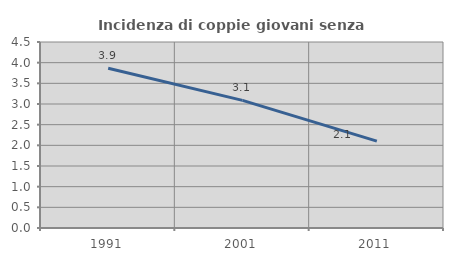
| Category | Incidenza di coppie giovani senza figli |
|---|---|
| 1991.0 | 3.866 |
| 2001.0 | 3.088 |
| 2011.0 | 2.101 |